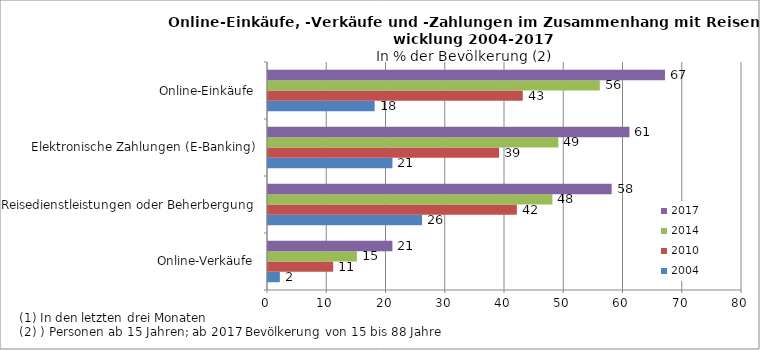
| Category | 2004 | 2010 | 2014 | 2017 |
|---|---|---|---|---|
| Online-Verkäufe | 2 | 11 | 15 | 21 |
| Reisedienstleistungen oder Beherbergung | 26 | 42 | 48 | 58 |
| Elektronische Zahlungen (E-Banking) | 21 | 39 | 49 | 61 |
| Online-Einkäufe | 18 | 43 | 56 | 67 |